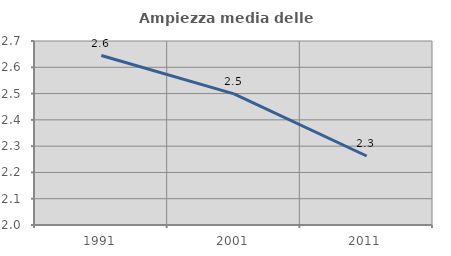
| Category | Ampiezza media delle famiglie |
|---|---|
| 1991.0 | 2.645 |
| 2001.0 | 2.499 |
| 2011.0 | 2.262 |